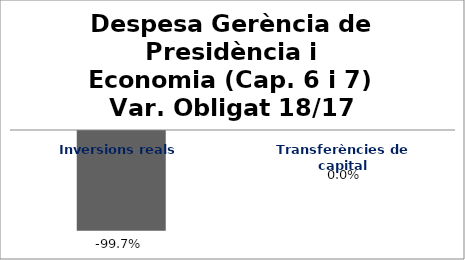
| Category | Series 0 |
|---|---|
| Inversions reals | -0.997 |
| Transferències de capital | 0 |